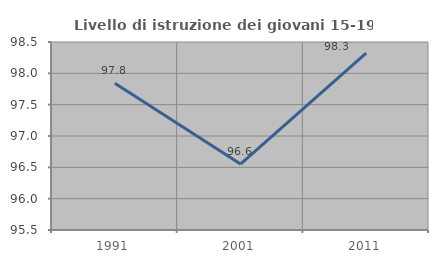
| Category | Livello di istruzione dei giovani 15-19 anni |
|---|---|
| 1991.0 | 97.842 |
| 2001.0 | 96.552 |
| 2011.0 | 98.324 |